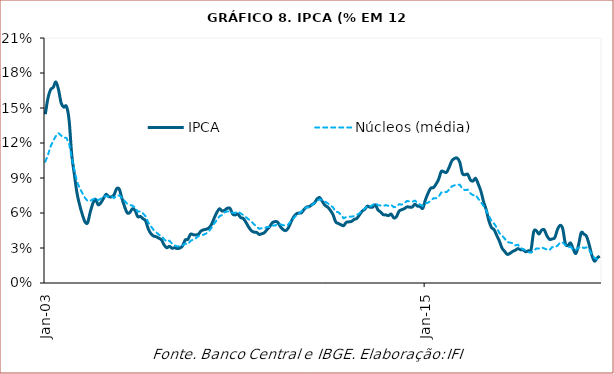
| Category | IPCA | Núcleos (média) |
|---|---|---|
| 2003-01-01 | 0.145 | 0.104 |
| 2003-02-01 | 0.158 | 0.11 |
| 2003-03-01 | 0.166 | 0.117 |
| 2003-04-01 | 0.168 | 0.122 |
| 2003-05-01 | 0.172 | 0.126 |
| 2003-06-01 | 0.166 | 0.128 |
| 2003-07-01 | 0.154 | 0.126 |
| 2003-08-01 | 0.151 | 0.125 |
| 2003-09-01 | 0.151 | 0.124 |
| 2003-10-01 | 0.14 | 0.12 |
| 2003-11-01 | 0.11 | 0.107 |
| 2003-12-01 | 0.093 | 0.097 |
| 2004-01-01 | 0.077 | 0.087 |
| 2004-02-01 | 0.067 | 0.081 |
| 2004-03-01 | 0.059 | 0.077 |
| 2004-04-01 | 0.053 | 0.073 |
| 2004-05-01 | 0.052 | 0.07 |
| 2004-06-01 | 0.061 | 0.07 |
| 2004-07-01 | 0.068 | 0.072 |
| 2004-08-01 | 0.072 | 0.073 |
| 2004-09-01 | 0.067 | 0.071 |
| 2004-10-01 | 0.069 | 0.072 |
| 2004-11-01 | 0.072 | 0.074 |
| 2004-12-01 | 0.076 | 0.075 |
| 2005-01-01 | 0.074 | 0.074 |
| 2005-02-01 | 0.074 | 0.074 |
| 2005-03-01 | 0.075 | 0.073 |
| 2005-04-01 | 0.081 | 0.075 |
| 2005-05-01 | 0.081 | 0.075 |
| 2005-06-01 | 0.073 | 0.073 |
| 2005-07-01 | 0.066 | 0.07 |
| 2005-08-01 | 0.06 | 0.068 |
| 2005-09-01 | 0.06 | 0.067 |
| 2005-10-01 | 0.064 | 0.066 |
| 2005-11-01 | 0.062 | 0.065 |
| 2005-12-01 | 0.057 | 0.061 |
| 2006-01-01 | 0.057 | 0.062 |
| 2006-02-01 | 0.055 | 0.06 |
| 2006-03-01 | 0.053 | 0.057 |
| 2006-04-01 | 0.046 | 0.052 |
| 2006-05-01 | 0.042 | 0.048 |
| 2006-06-01 | 0.04 | 0.046 |
| 2006-07-01 | 0.04 | 0.044 |
| 2006-08-01 | 0.038 | 0.041 |
| 2006-09-01 | 0.037 | 0.04 |
| 2006-10-01 | 0.033 | 0.038 |
| 2006-11-01 | 0.03 | 0.035 |
| 2006-12-01 | 0.031 | 0.036 |
| 2007-01-01 | 0.03 | 0.034 |
| 2007-02-01 | 0.03 | 0.032 |
| 2007-03-01 | 0.03 | 0.031 |
| 2007-04-01 | 0.03 | 0.032 |
| 2007-05-01 | 0.032 | 0.032 |
| 2007-06-01 | 0.037 | 0.034 |
| 2007-07-01 | 0.037 | 0.033 |
| 2007-08-01 | 0.042 | 0.036 |
| 2007-09-01 | 0.041 | 0.037 |
| 2007-10-01 | 0.041 | 0.038 |
| 2007-11-01 | 0.042 | 0.04 |
| 2007-12-01 | 0.045 | 0.041 |
| 2008-01-01 | 0.046 | 0.041 |
| 2008-02-01 | 0.046 | 0.043 |
| 2008-03-01 | 0.047 | 0.044 |
| 2008-04-01 | 0.05 | 0.047 |
| 2008-05-01 | 0.056 | 0.051 |
| 2008-06-01 | 0.061 | 0.054 |
| 2008-07-01 | 0.064 | 0.057 |
| 2008-08-01 | 0.062 | 0.058 |
| 2008-09-01 | 0.063 | 0.061 |
| 2008-10-01 | 0.064 | 0.061 |
| 2008-11-01 | 0.064 | 0.061 |
| 2008-12-01 | 0.059 | 0.06 |
| 2009-01-01 | 0.058 | 0.06 |
| 2009-02-01 | 0.059 | 0.061 |
| 2009-03-01 | 0.056 | 0.06 |
| 2009-04-01 | 0.055 | 0.058 |
| 2009-05-01 | 0.052 | 0.056 |
| 2009-06-01 | 0.048 | 0.055 |
| 2009-07-01 | 0.045 | 0.053 |
| 2009-08-01 | 0.044 | 0.05 |
| 2009-09-01 | 0.043 | 0.048 |
| 2009-10-01 | 0.042 | 0.046 |
| 2009-11-01 | 0.042 | 0.047 |
| 2009-12-01 | 0.043 | 0.047 |
| 2010-01-01 | 0.046 | 0.048 |
| 2010-02-01 | 0.048 | 0.048 |
| 2010-03-01 | 0.052 | 0.049 |
| 2010-04-01 | 0.053 | 0.049 |
| 2010-05-01 | 0.052 | 0.051 |
| 2010-06-01 | 0.048 | 0.05 |
| 2010-07-01 | 0.046 | 0.049 |
| 2010-08-01 | 0.045 | 0.049 |
| 2010-09-01 | 0.047 | 0.05 |
| 2010-10-01 | 0.052 | 0.053 |
| 2010-11-01 | 0.056 | 0.055 |
| 2010-12-01 | 0.059 | 0.058 |
| 2011-01-01 | 0.06 | 0.059 |
| 2011-02-01 | 0.06 | 0.061 |
| 2011-03-01 | 0.063 | 0.063 |
| 2011-04-01 | 0.065 | 0.065 |
| 2011-05-01 | 0.066 | 0.065 |
| 2011-06-01 | 0.067 | 0.067 |
| 2011-07-01 | 0.069 | 0.069 |
| 2011-08-01 | 0.072 | 0.071 |
| 2011-09-01 | 0.073 | 0.072 |
| 2011-10-01 | 0.07 | 0.071 |
| 2011-11-01 | 0.066 | 0.07 |
| 2011-12-01 | 0.065 | 0.068 |
| 2012-01-01 | 0.062 | 0.067 |
| 2012-02-01 | 0.058 | 0.065 |
| 2012-03-01 | 0.052 | 0.061 |
| 2012-04-01 | 0.051 | 0.061 |
| 2012-05-01 | 0.05 | 0.058 |
| 2012-06-01 | 0.049 | 0.055 |
| 2012-07-01 | 0.052 | 0.057 |
| 2012-08-01 | 0.052 | 0.057 |
| 2012-09-01 | 0.053 | 0.057 |
| 2012-10-01 | 0.055 | 0.057 |
| 2012-11-01 | 0.055 | 0.058 |
| 2012-12-01 | 0.058 | 0.06 |
| 2013-01-01 | 0.062 | 0.062 |
| 2013-02-01 | 0.063 | 0.064 |
| 2013-03-01 | 0.066 | 0.066 |
| 2013-04-01 | 0.065 | 0.066 |
| 2013-05-01 | 0.065 | 0.067 |
| 2013-06-01 | 0.067 | 0.068 |
| 2013-07-01 | 0.063 | 0.067 |
| 2013-08-01 | 0.061 | 0.066 |
| 2013-09-01 | 0.059 | 0.066 |
| 2013-10-01 | 0.058 | 0.067 |
| 2013-11-01 | 0.058 | 0.066 |
| 2013-12-01 | 0.059 | 0.067 |
| 2014-01-01 | 0.056 | 0.065 |
| 2014-02-01 | 0.057 | 0.065 |
| 2014-03-01 | 0.062 | 0.068 |
| 2014-04-01 | 0.063 | 0.067 |
| 2014-05-01 | 0.064 | 0.068 |
| 2014-06-01 | 0.065 | 0.07 |
| 2014-07-01 | 0.065 | 0.07 |
| 2014-08-01 | 0.065 | 0.07 |
| 2014-09-01 | 0.067 | 0.071 |
| 2014-10-01 | 0.066 | 0.069 |
| 2014-11-01 | 0.066 | 0.067 |
| 2014-12-01 | 0.064 | 0.066 |
| 2015-01-01 | 0.071 | 0.068 |
| 2015-02-01 | 0.077 | 0.069 |
| 2015-03-01 | 0.081 | 0.071 |
| 2015-04-01 | 0.082 | 0.073 |
| 2015-05-01 | 0.085 | 0.073 |
| 2015-06-01 | 0.089 | 0.074 |
| 2015-07-01 | 0.096 | 0.078 |
| 2015-08-01 | 0.095 | 0.078 |
| 2015-09-01 | 0.095 | 0.078 |
| 2015-10-01 | 0.099 | 0.08 |
| 2015-11-01 | 0.105 | 0.083 |
| 2015-12-01 | 0.107 | 0.084 |
| 2016-01-01 | 0.107 | 0.084 |
| 2016-02-01 | 0.104 | 0.084 |
| 2016-03-01 | 0.094 | 0.081 |
| 2016-04-01 | 0.093 | 0.08 |
| 2016-05-01 | 0.093 | 0.08 |
| 2016-06-01 | 0.088 | 0.077 |
| 2016-07-01 | 0.087 | 0.075 |
| 2016-08-01 | 0.09 | 0.075 |
| 2016-09-01 | 0.085 | 0.072 |
| 2016-10-01 | 0.079 | 0.069 |
| 2016-11-01 | 0.07 | 0.066 |
| 2016-12-01 | 0.063 | 0.062 |
| 2017-01-01 | 0.054 | 0.058 |
| 2017-02-01 | 0.048 | 0.053 |
| 2017-03-01 | 0.046 | 0.051 |
| 2017-04-01 | 0.041 | 0.047 |
| 2017-05-01 | 0.036 | 0.043 |
| 2017-06-01 | 0.03 | 0.041 |
| 2017-07-01 | 0.027 | 0.038 |
| 2017-08-01 | 0.025 | 0.035 |
| 2017-09-01 | 0.025 | 0.035 |
| 2017-10-01 | 0.027 | 0.034 |
| 2017-11-01 | 0.028 | 0.032 |
| 2017-12-01 | 0.029 | 0.033 |
| 2018-01-01 | 0.029 | 0.03 |
| 2018-02-01 | 0.028 | 0.029 |
| 2018-03-01 | 0.027 | 0.028 |
| 2018-04-01 | 0.028 | 0.026 |
| 2018-05-01 | 0.029 | 0.026 |
| 2018-06-01 | 0.044 | 0.028 |
| 2018-07-01 | 0.045 | 0.03 |
| 2018-08-01 | 0.042 | 0.03 |
| 2018-09-01 | 0.045 | 0.031 |
| 2018-10-01 | 0.046 | 0.03 |
| 2018-11-01 | 0.04 | 0.029 |
| 2018-12-01 | 0.037 | 0.028 |
| 2019-01-01 | 0.038 | 0.031 |
| 2019-02-01 | 0.039 | 0.031 |
| 2019-03-01 | 0.046 | 0.032 |
| 2019-04-01 | 0.049 | 0.035 |
| 2019-05-01 | 0.047 | 0.035 |
| 2019-06-01 | 0.034 | 0.033 |
| 2019-07-01 | 0.032 | 0.031 |
| 2019-08-01 | 0.034 | 0.031 |
| 2019-09-01 | 0.029 | 0.029 |
| 2019-10-01 | 0.025 | 0.028 |
| 2019-11-01 | 0.033 | 0.03 |
| 2019-12-01 | 0.043 | 0.031 |
| 2020-01-01 | 0.042 | 0.03 |
| 2020-02-01 | 0.04 | 0.031 |
| 2020-03-01 | 0.033 | 0.028 |
| 2020-04-01 | 0.024 | 0.024 |
| 2020-05-01 | 0.019 | 0.022 |
| 2020-06-01 | 0.021 | 0.02 |
| 2020-07-01 | 0.023 | 0.02 |